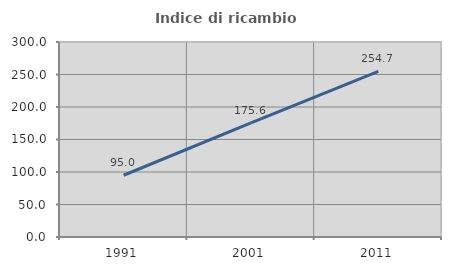
| Category | Indice di ricambio occupazionale  |
|---|---|
| 1991.0 | 95 |
| 2001.0 | 175.556 |
| 2011.0 | 254.717 |